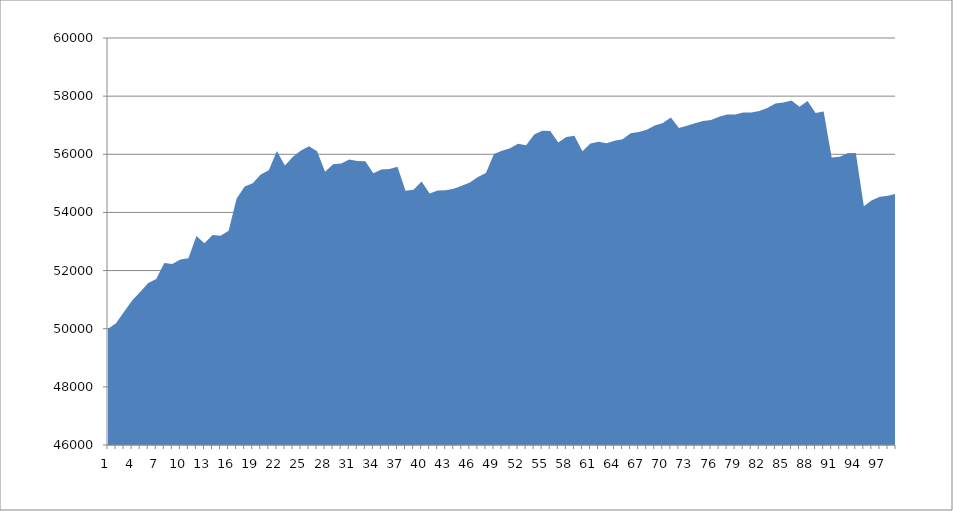
| Category | Series 0 |
|---|---|
| 0 | 50000 |
| 1 | 50185.185 |
| 2 | 50585.185 |
| 3 | 50973.977 |
| 4 | 51265.977 |
| 5 | 51576.741 |
| 6 | 51711.523 |
| 7 | 52262.893 |
| 8 | 52230.24 |
| 9 | 52381.556 |
| 10 | 52425.915 |
| 11 | 53192.581 |
| 12 | 52939.146 |
| 13 | 53220.069 |
| 14 | 53197.341 |
| 15 | 53369.61 |
| 16 | 54480.721 |
| 17 | 54888.365 |
| 18 | 55001.902 |
| 19 | 55308.308 |
| 20 | 55448.308 |
| 21 | 56110.305 |
| 22 | 55610.305 |
| 23 | 55916.954 |
| 24 | 56129.798 |
| 25 | 56279.798 |
| 26 | 56105.301 |
| 27 | 55401.645 |
| 28 | 55657.201 |
| 29 | 55686.925 |
| 30 | 55823.001 |
| 31 | 55769.596 |
| 32 | 55759.375 |
| 33 | 55350.284 |
| 34 | 55480.284 |
| 35 | 55492.498 |
| 36 | 55570.42 |
| 37 | 54746.89 |
| 38 | 54783.7 |
| 39 | 55066.459 |
| 40 | 54651.074 |
| 41 | 54754.078 |
| 42 | 54760.213 |
| 43 | 54816.924 |
| 44 | 54917.296 |
| 45 | 55025.73 |
| 46 | 55220.535 |
| 47 | 55353.465 |
| 48 | 56009.309 |
| 49 | 56118.959 |
| 50 | 56205.212 |
| 51 | 56362.876 |
| 52 | 56307.394 |
| 53 | 56678.935 |
| 54 | 56813.264 |
| 55 | 56799.502 |
| 56 | 56409.112 |
| 57 | 56596.44 |
| 58 | 56640.493 |
| 59 | 56102.227 |
| 60 | 56370.449 |
| 61 | 56434.248 |
| 62 | 56376.841 |
| 63 | 56464.524 |
| 64 | 56518.022 |
| 65 | 56724.747 |
| 66 | 56770.361 |
| 67 | 56848.099 |
| 68 | 56992.896 |
| 69 | 57073.571 |
| 70 | 57266.481 |
| 71 | 56908.016 |
| 72 | 56984.939 |
| 73 | 57069.276 |
| 74 | 57147.627 |
| 75 | 57179.83 |
| 76 | 57291.17 |
| 77 | 57366.35 |
| 78 | 57371.599 |
| 79 | 57439.215 |
| 80 | 57440.895 |
| 81 | 57490.895 |
| 82 | 57593.679 |
| 83 | 57746.643 |
| 84 | 57785.413 |
| 85 | 57849.748 |
| 86 | 57639.346 |
| 87 | 57828.82 |
| 88 | 57417.055 |
| 89 | 57471.335 |
| 90 | 55888.376 |
| 91 | 55913.907 |
| 92 | 56031.989 |
| 93 | 56044.711 |
| 94 | 54210.631 |
| 95 | 54422.612 |
| 96 | 54536.647 |
| 97 | 54575.903 |
| 98 | 54646.648 |